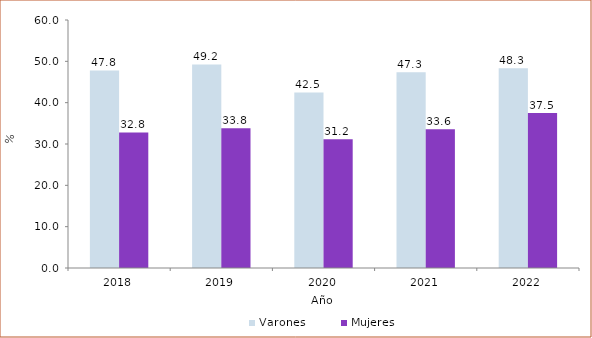
| Category | Varones | Mujeres |
|---|---|---|
| 2018 | 47.802 | 32.783 |
| 2019 | 49.247 | 33.809 |
| 2020 | 42.482 | 31.174 |
| 2021 | 47.33 | 33.567 |
| 2022 | 48.3 | 37.5 |